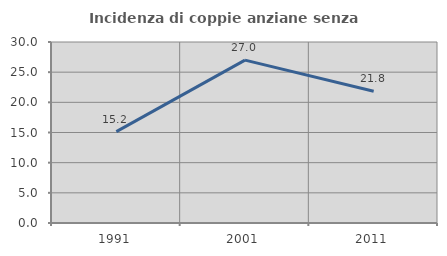
| Category | Incidenza di coppie anziane senza figli  |
|---|---|
| 1991.0 | 15.152 |
| 2001.0 | 27 |
| 2011.0 | 21.839 |